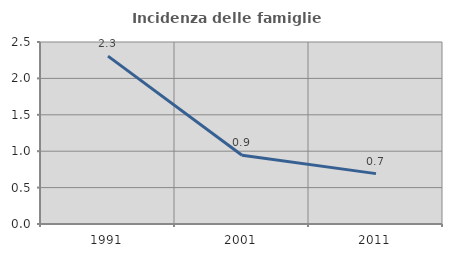
| Category | Incidenza delle famiglie numerose |
|---|---|
| 1991.0 | 2.305 |
| 2001.0 | 0.943 |
| 2011.0 | 0.692 |